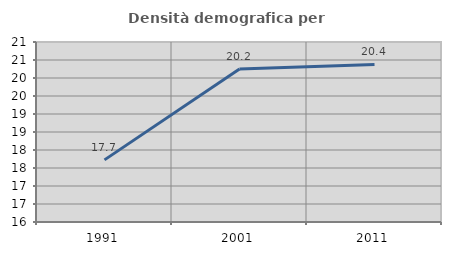
| Category | Densità demografica |
|---|---|
| 1991.0 | 17.726 |
| 2001.0 | 20.249 |
| 2011.0 | 20.378 |